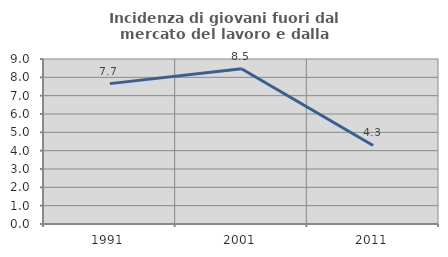
| Category | Incidenza di giovani fuori dal mercato del lavoro e dalla formazione  |
|---|---|
| 1991.0 | 7.657 |
| 2001.0 | 8.466 |
| 2011.0 | 4.286 |